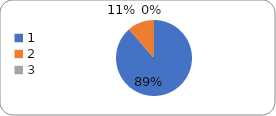
| Category | Series 0 |
|---|---|
| 0 | 93 |
| 1 | 12 |
| 2 | 0 |